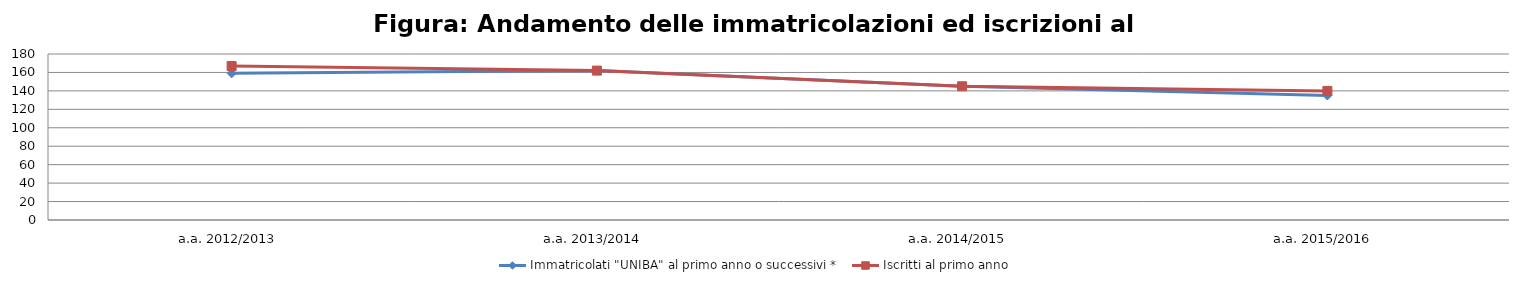
| Category | Immatricolati "UNIBA" al primo anno o successivi * | Iscritti al primo anno  |
|---|---|---|
| a.a. 2012/2013 | 159 | 167 |
| a.a. 2013/2014 | 162 | 162 |
| a.a. 2014/2015 | 145 | 145 |
| a.a. 2015/2016 | 135 | 140 |